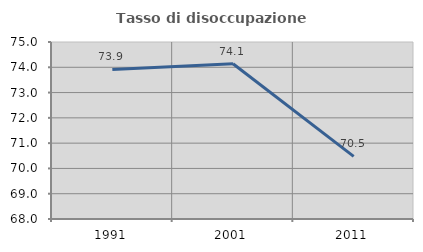
| Category | Tasso di disoccupazione giovanile  |
|---|---|
| 1991.0 | 73.913 |
| 2001.0 | 74.138 |
| 2011.0 | 70.476 |